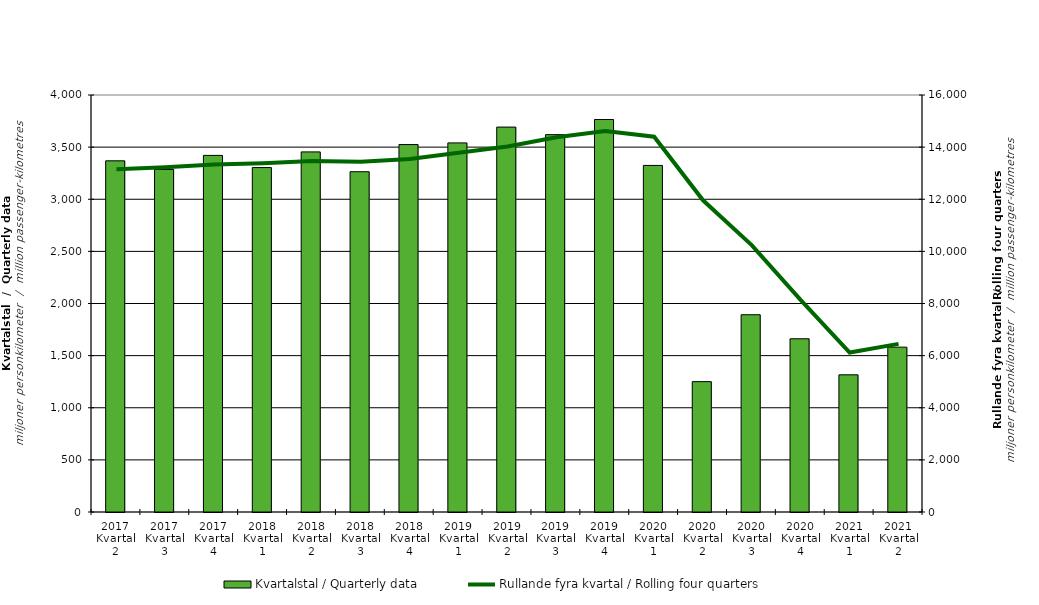
| Category | Kvartalstal / Quarterly data |
|---|---|
| 2017 Kvartal 2 | 3368.63 |
| 2017 Kvartal 3 | 3285.241 |
| 2017 Kvartal 4 | 3420.641 |
| 2018 Kvartal 1 | 3303.883 |
| 2018 Kvartal 2 | 3454.255 |
| 2018 Kvartal 3 | 3264.066 |
| 2018 Kvartal 4 | 3524.594 |
| 2019 Kvartal 1 | 3540.48 |
| 2019 Kvartal 2 | 3692.248 |
| 2019 Kvartal 3 | 3619.721 |
| 2019 Kvartal 4 | 3764.759 |
| 2020 Kvartal 1 | 3324.383 |
| 2020 Kvartal 2 | 1250.488 |
| 2020 Kvartal 3 | 1892.351 |
| 2020 Kvartal 4 | 1661.523 |
| 2021 Kvartal 1 | 1315.837 |
| 2021 Kvartal 2 | 1581.257 |